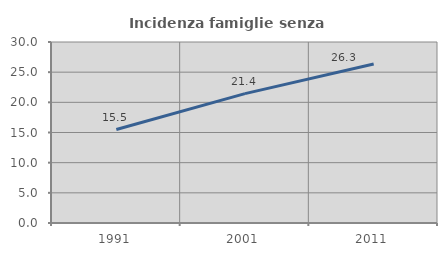
| Category | Incidenza famiglie senza nuclei |
|---|---|
| 1991.0 | 15.49 |
| 2001.0 | 21.44 |
| 2011.0 | 26.348 |